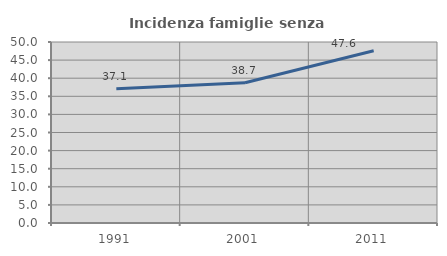
| Category | Incidenza famiglie senza nuclei |
|---|---|
| 1991.0 | 37.12 |
| 2001.0 | 38.743 |
| 2011.0 | 47.591 |